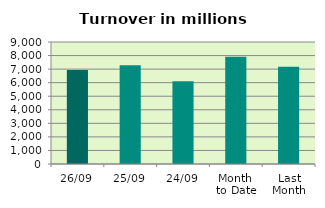
| Category | Series 0 |
|---|---|
| 26/09 | 6940.175 |
| 25/09 | 7291.366 |
| 24/09 | 6111.792 |
| Month 
to Date | 7907.355 |
| Last
Month | 7181.07 |